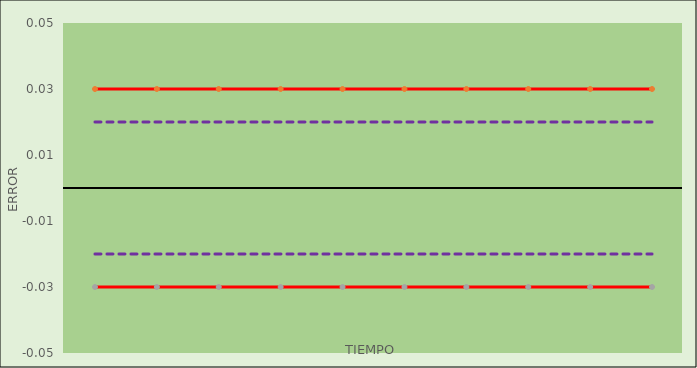
| Category | Error de Indicación |  ±EMP  | 2/ 3±EMP  | 2/3 ±EMP  |
|---|---|---|---|---|
|  |  | -0.03 | 0.02 | -0.02 |
|  |  | -0.03 | 0.02 | -0.02 |
|  |  | -0.03 | 0.02 | -0.02 |
|  |  | -0.03 | 0.02 | -0.02 |
|  |  | -0.03 | 0.02 | -0.02 |
|  |  | -0.03 | 0.02 | -0.02 |
|  |  | -0.03 | 0.02 | -0.02 |
|  |  | -0.03 | 0.02 | -0.02 |
|  |  | -0.03 | 0.02 | -0.02 |
|  |  | -0.03 | 0.02 | -0.02 |